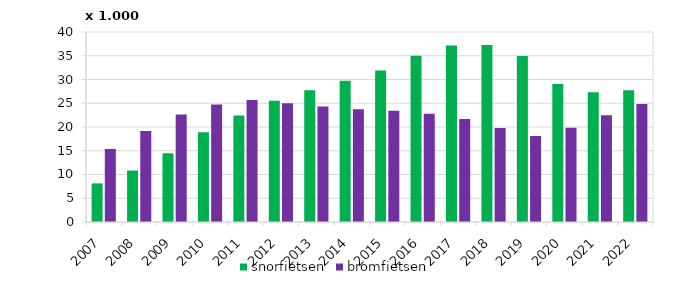
| Category | snorfietsen | bromfietsen |
|---|---|---|
| 2007.0 | 8131 | 15378 |
| 2008.0 | 10830 | 19184 |
| 2009.0 | 14472 | 22635 |
| 2010.0 | 18897 | 24733 |
| 2011.0 | 22408 | 25672 |
| 2012.0 | 25507 | 25018 |
| 2013.0 | 27728 | 24322 |
| 2014.0 | 29722 | 23723 |
| 2015.0 | 31900 | 23445 |
| 2016.0 | 35023 | 22786 |
| 2017.0 | 37144 | 21678 |
| 2018.0 | 37257 | 19791 |
| 2019.0 | 34941 | 18097 |
| 2020.0 | 29048 | 19868 |
| 2021.0 | 27342 | 22488 |
| 2022.0 | 27760 | 24818 |